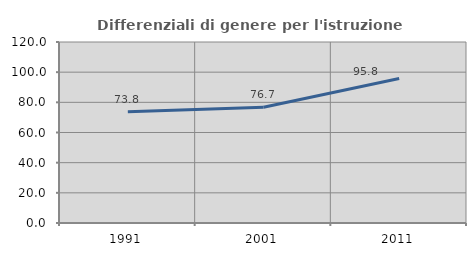
| Category | Differenziali di genere per l'istruzione superiore |
|---|---|
| 1991.0 | 73.785 |
| 2001.0 | 76.681 |
| 2011.0 | 95.844 |